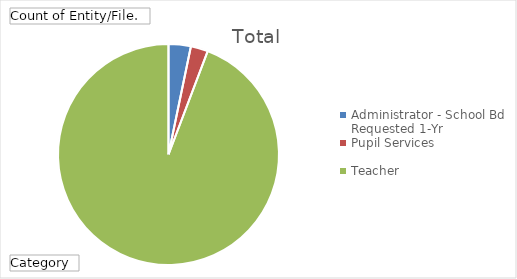
| Category | Total |
|---|---|
| Administrator - School Bd Requested 1-Yr | 84 |
| Pupil Services | 65 |
| Teacher | 2432 |